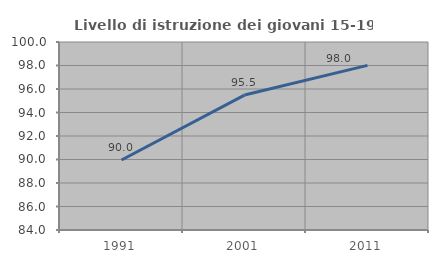
| Category | Livello di istruzione dei giovani 15-19 anni |
|---|---|
| 1991.0 | 89.96 |
| 2001.0 | 95.484 |
| 2011.0 | 98.013 |